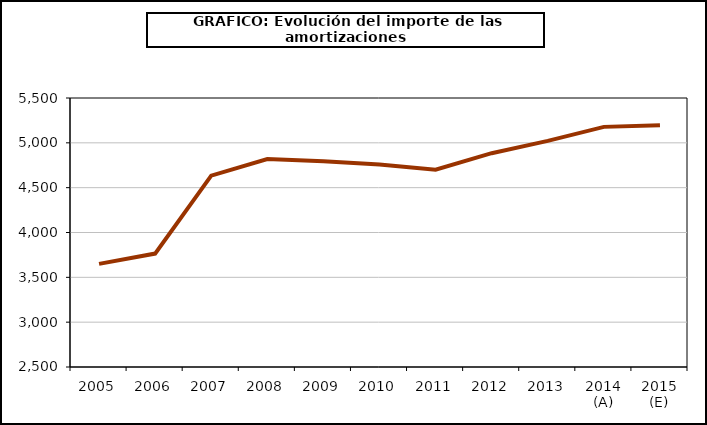
| Category | amortizacion |
|---|---|
| 2005 | 3649.992 |
| 2006 | 3764.885 |
| 2007 | 4634.4 |
| 2008 | 4820.083 |
| 2009 | 4794.062 |
| 2010 | 4758.255 |
| 2011 | 4699.859 |
| 2012 | 4884.543 |
| 2013 | 5021.523 |
| 2014 (A) | 5177.991 |
| 2015 (E) | 5194.907 |